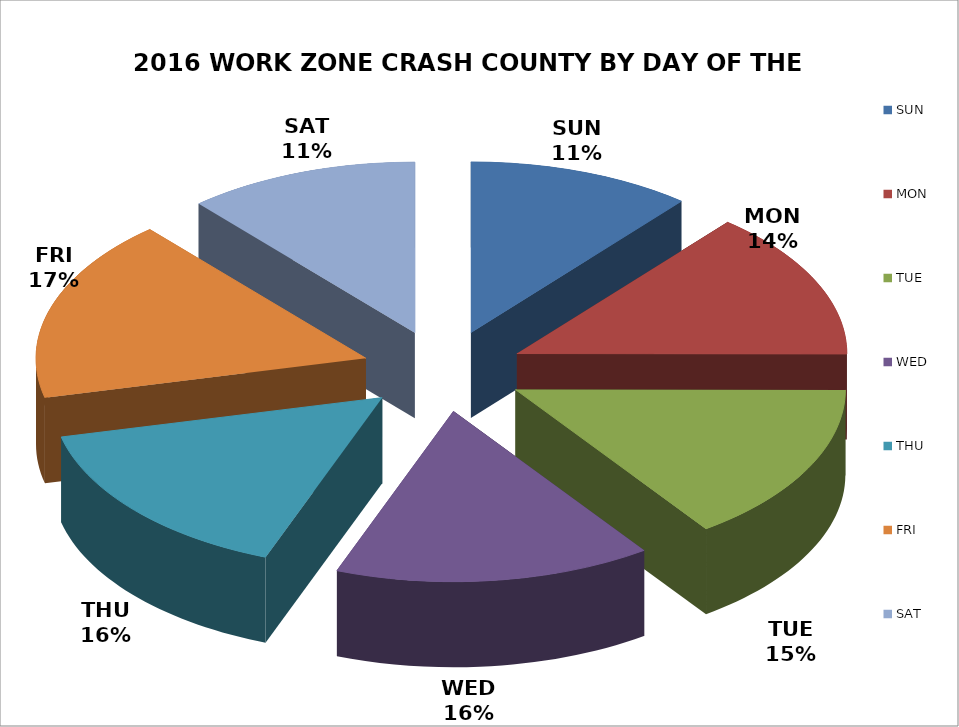
| Category | COUNT | % |
|---|---|---|
| SUN | 642 | 0.11 |
| MON | 818 | 0.14 |
| TUE | 884 | 0.152 |
| WED | 907 | 0.156 |
| THU | 906 | 0.155 |
| FRI | 1011 | 0.173 |
| SAT | 663 | 0.114 |